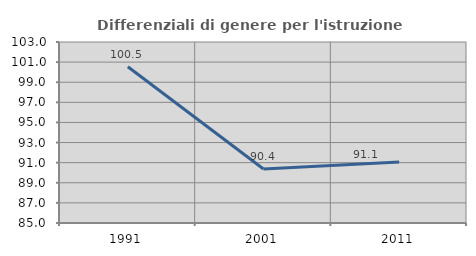
| Category | Differenziali di genere per l'istruzione superiore |
|---|---|
| 1991.0 | 100.534 |
| 2001.0 | 90.367 |
| 2011.0 | 91.068 |